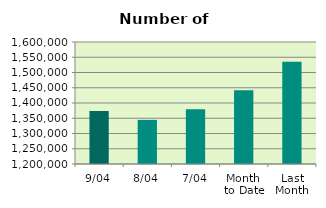
| Category | Series 0 |
|---|---|
| 9/04 | 1373600 |
| 8/04 | 1344648 |
| 7/04 | 1379756 |
| Month 
to Date | 1441687.2 |
| Last
Month | 1535393.739 |